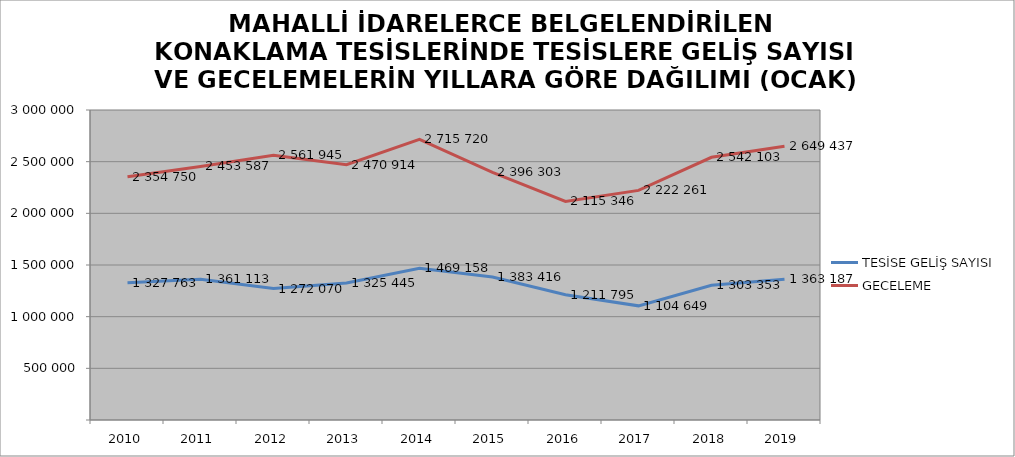
| Category | TESİSE GELİŞ SAYISI | GECELEME |
|---|---|---|
| 2010 | 1327763 | 2354750 |
| 2011 | 1361113 | 2453587 |
| 2012 | 1272070 | 2561945 |
| 2013 | 1325445 | 2470914 |
| 2014 | 1469158 | 2715720 |
| 2015 | 1383416 | 2396303 |
| 2016 | 1211795 | 2115346 |
| 2017 | 1104649 | 2222261 |
| 2018 | 1303353 | 2542103 |
| 2019 | 1363187 | 2649437 |